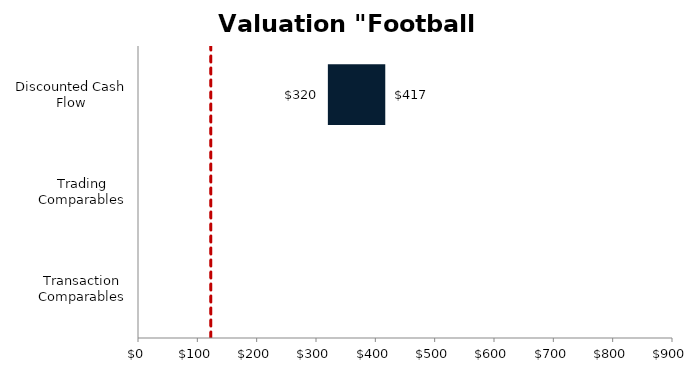
| Category | Low | Delta | High |
|---|---|---|---|
| Discounted Cash Flow | 319.998 | 96.745 | 416.743 |
| Trading Comparables | 0 | 0 | 0 |
| Transaction Comparables | 0 | 0 | 0 |